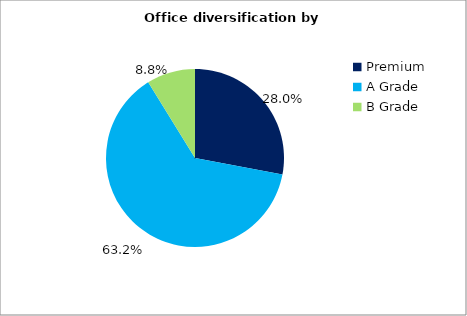
| Category | Series 0 |
|---|---|
| Premium | 0.28 |
| A Grade | 0.632 |
| B Grade | 0.088 |
| C Grade | 0 |